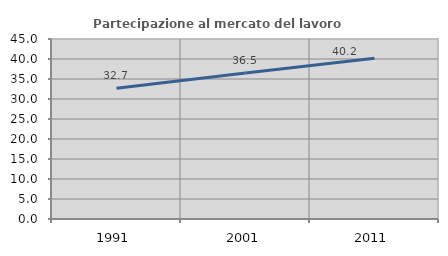
| Category | Partecipazione al mercato del lavoro  femminile |
|---|---|
| 1991.0 | 32.689 |
| 2001.0 | 36.478 |
| 2011.0 | 40.175 |